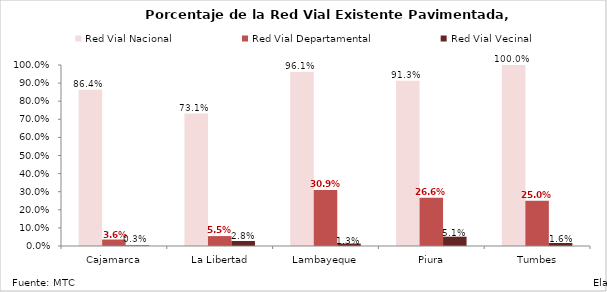
| Category | Red Vial Nacional | Red Vial Departamental | Red Vial Vecinal |
|---|---|---|---|
|  Cajamarca | 0.864 | 0.036 | 0.003 |
|  La Libertad | 0.731 | 0.055 | 0.028 |
|  Lambayeque | 0.961 | 0.309 | 0.013 |
|  Piura | 0.913 | 0.266 | 0.051 |
|  Tumbes | 1 | 0.25 | 0.016 |